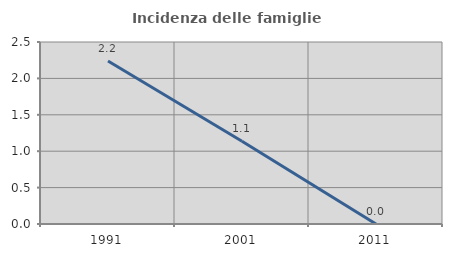
| Category | Incidenza delle famiglie numerose |
|---|---|
| 1991.0 | 2.239 |
| 2001.0 | 1.136 |
| 2011.0 | 0 |